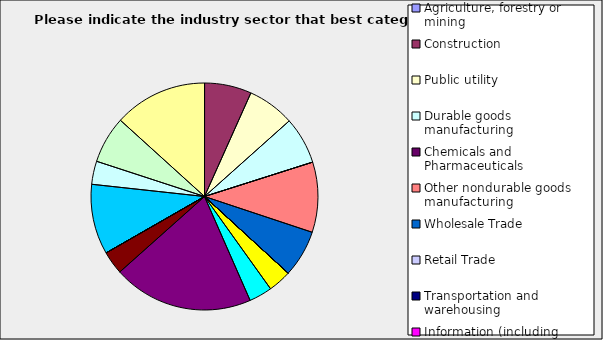
| Category | Series 0 |
|---|---|
| Agriculture, forestry or mining | 0 |
| Construction | 0.067 |
| Public utility | 0.067 |
| Durable goods manufacturing | 0.067 |
| Chemicals and Pharmaceuticals | 0 |
| Other nondurable goods manufacturing | 0.1 |
| Wholesale Trade | 0.067 |
| Retail Trade | 0 |
| Transportation and warehousing | 0 |
| Information (including broadcasting and telecommunication) | 0 |
| Finance and Insurance | 0.033 |
| Real Estate | 0.033 |
| Professional, scientific and technical services | 0.2 |
| Consulting | 0.033 |
| Administrative and office services (including waste management) | 0 |
| Education | 0 |
| Health Care and social services | 0.1 |
| Arts, entertainment and recreation | 0.033 |
| Accommodation and food services | 0.067 |
| Other | 0.133 |